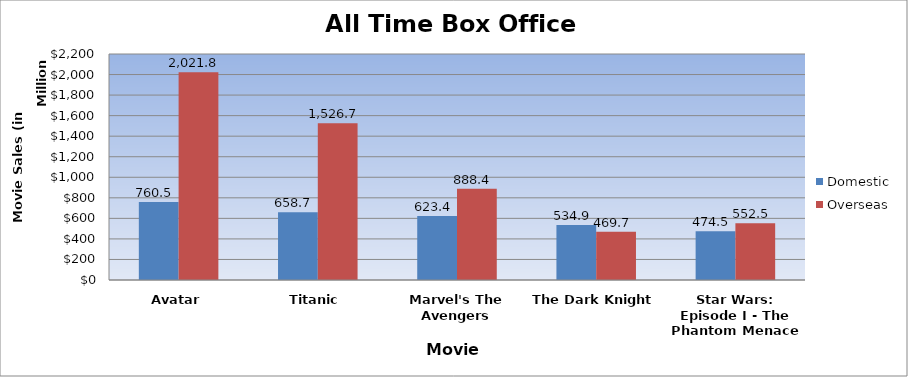
| Category | Domestic | Overseas |
|---|---|---|
| Avatar | 760507625 | 2021800000 |
| Titanic | 658672302 | 1526700000 |
| Marvel's The Avengers | 623357910 | 888400000 |
| The Dark Knight | 534858444 | 469700000 |
| Star Wars: Episode I - The Phantom Menace | 474544677 | 552500000 |